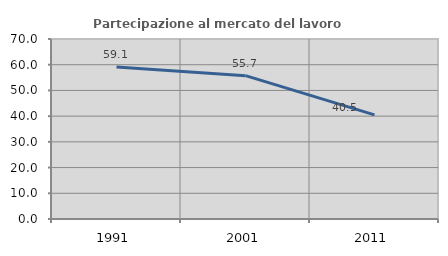
| Category | Partecipazione al mercato del lavoro  femminile |
|---|---|
| 1991.0 | 59.091 |
| 2001.0 | 55.738 |
| 2011.0 | 40.506 |